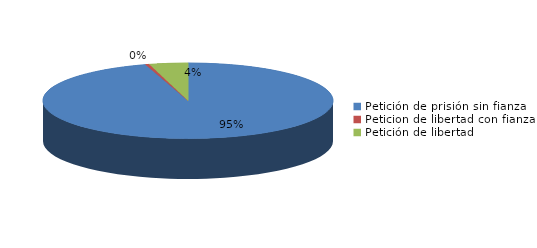
| Category | Series 0 |
|---|---|
| Petición de prisión sin fianza | 443 |
| Peticion de libertad con fianza | 2 |
| Petición de libertad | 20 |